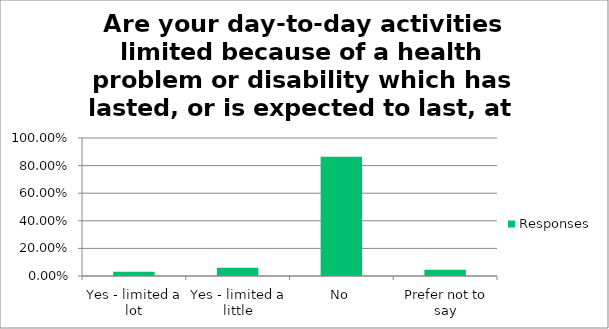
| Category | Responses |
|---|---|
| Yes - limited a lot | 0.03 |
| Yes - limited a little | 0.061 |
| No | 0.864 |
| Prefer not to say | 0.046 |